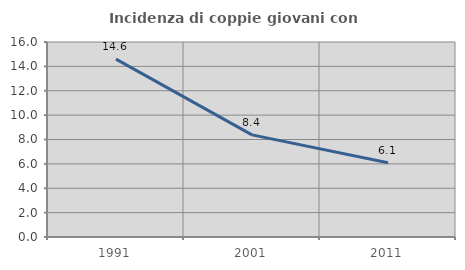
| Category | Incidenza di coppie giovani con figli |
|---|---|
| 1991.0 | 14.6 |
| 2001.0 | 8.378 |
| 2011.0 | 6.092 |